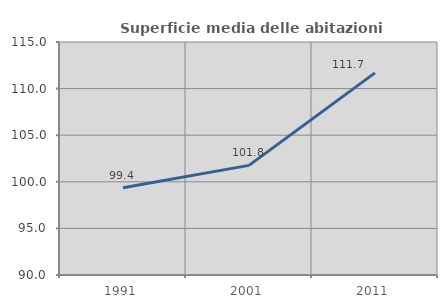
| Category | Superficie media delle abitazioni occupate |
|---|---|
| 1991.0 | 99.371 |
| 2001.0 | 101.761 |
| 2011.0 | 111.685 |